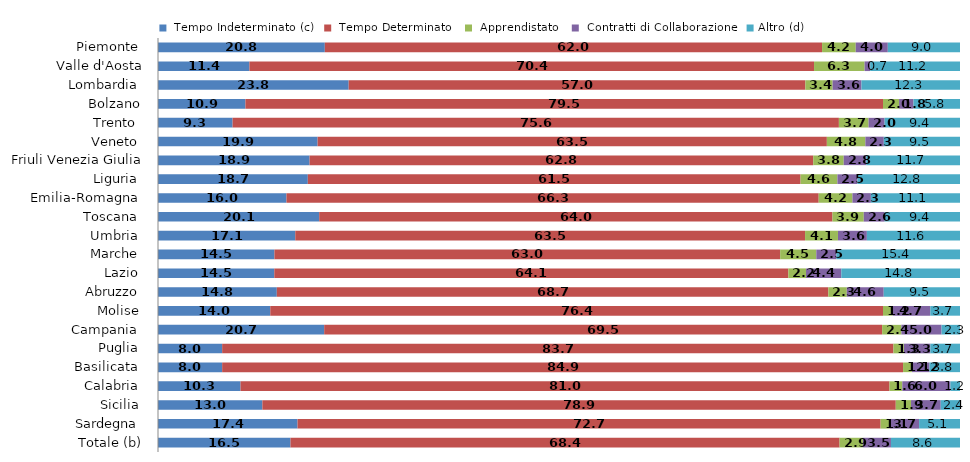
| Category |  Tempo Indeterminato (c) |  Tempo Determinato  |  Apprendistato  |  Contratti di Collaborazione | Altro (d) |
|---|---|---|---|---|---|
| Piemonte  | 20.8 | 62 | 4.2 | 4 | 9 |
| Valle d'Aosta | 11.4 | 70.4 | 6.3 | 0.7 | 11.2 |
| Lombardia  | 23.8 | 57 | 3.4 | 3.6 | 12.3 |
|          Bolzano | 10.9 | 79.5 | 2 | 1.8 | 5.8 |
|         Trento  | 9.3 | 75.6 | 3.7 | 2 | 9.4 |
| Veneto  | 19.9 | 63.5 | 4.8 | 2.3 | 9.5 |
| Friuli Venezia Giulia | 18.9 | 62.8 | 3.8 | 2.8 | 11.7 |
| Liguria  | 18.7 | 61.5 | 4.6 | 2.5 | 12.8 |
| Emilia-Romagna  | 16 | 66.3 | 4.2 | 2.3 | 11.1 |
| Toscana  | 20.1 | 64 | 3.9 | 2.6 | 9.4 |
| Umbria  | 17.1 | 63.5 | 4.1 | 3.6 | 11.6 |
| Marche  | 14.5 | 63 | 4.5 | 2.5 | 15.4 |
| Lazio  | 14.5 | 64.1 | 2.2 | 4.4 | 14.8 |
| Abruzzo  | 14.8 | 68.7 | 2.3 | 4.6 | 9.5 |
| Molise  | 14 | 76.4 | 1.2 | 4.7 | 3.7 |
| Campania  | 20.7 | 69.5 | 2.4 | 5 | 2.3 |
| Puglia  | 8 | 83.7 | 1.3 | 3.3 | 3.7 |
| Basilicata  | 8 | 84.9 | 1.1 | 2.2 | 3.8 |
| Calabria  | 10.3 | 81 | 1.6 | 6 | 1.2 |
| Sicilia  | 13 | 78.9 | 1.9 | 3.7 | 2.4 |
| Sardegna  | 17.4 | 72.7 | 1.1 | 3.7 | 5.1 |
| Totale (b) | 16.5 | 68.4 | 2.9 | 3.5 | 8.6 |